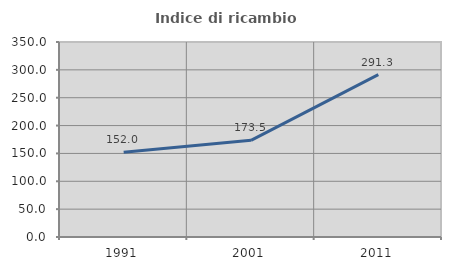
| Category | Indice di ricambio occupazionale  |
|---|---|
| 1991.0 | 152.041 |
| 2001.0 | 173.545 |
| 2011.0 | 291.304 |